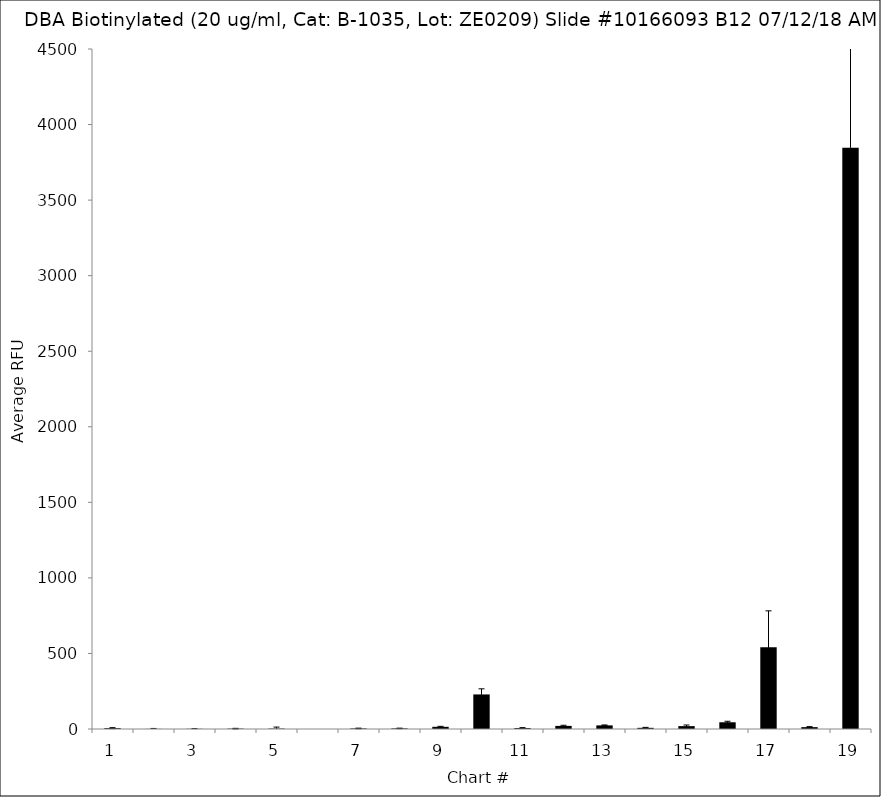
| Category | Series 0 |
|---|---|
| 1.0 | 5.75 |
| 2.0 | 0.75 |
| 3.0 | 1.25 |
| 4.0 | 2.5 |
| 5.0 | 2.75 |
| 6.0 | -1 |
| 7.0 | 3.75 |
| 8.0 | 4 |
| 9.0 | 14.5 |
| 10.0 | 228.75 |
| 11.0 | 6.25 |
| 12.0 | 20.5 |
| 13.0 | 24 |
| 14.0 | 7.75 |
| 15.0 | 19 |
| 16.0 | 44.5 |
| 17.0 | 540.75 |
| 18.0 | 12.25 |
| 19.0 | 3846.25 |